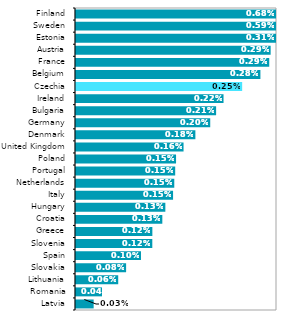
| Category | Series 0 |
|---|---|
| Latvia | 0 |
| Romania | 0 |
| Lithuania | 0.001 |
| Slovakia | 0.001 |
| Spain | 0.001 |
| Slovenia | 0.001 |
| Greece | 0.001 |
| Croatia | 0.001 |
| Hungary | 0.001 |
| Italy | 0.001 |
| Netherlands | 0.001 |
| Portugal | 0.001 |
| Poland | 0.002 |
| United Kingdom | 0.002 |
| Denmark | 0.002 |
| Germany | 0.002 |
| Bulgaria | 0.002 |
| Ireland | 0.002 |
| Czechia | 0.002 |
| Belgium | 0.003 |
| France | 0.003 |
| Austria | 0.003 |
| Estonia | 0.003 |
| Sweden | 0.006 |
| Finland | 0.007 |